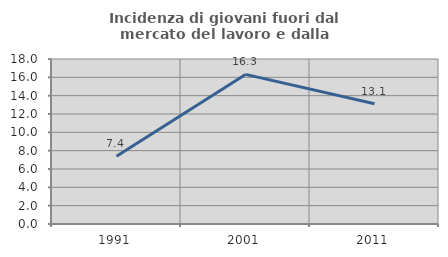
| Category | Incidenza di giovani fuori dal mercato del lavoro e dalla formazione  |
|---|---|
| 1991.0 | 7.39 |
| 2001.0 | 16.319 |
| 2011.0 | 13.118 |